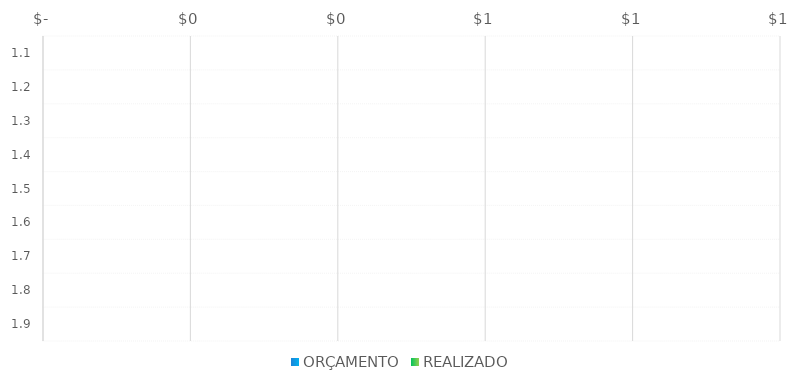
| Category | ORÇAMENTO | REALIZADO |
|---|---|---|
| 1.1 |  | 0 |
| 1.2 |  | 0 |
| 1.3 |  | 0 |
| 1.4 |  | 0 |
| 1.5 |  | 0 |
| 1.6 |  | 0 |
| 1.7 |  | 0 |
| 1.8 |  | 0 |
| 1.9 |  | 0 |